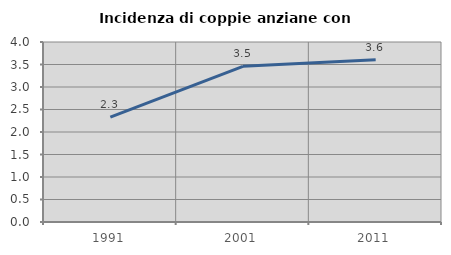
| Category | Incidenza di coppie anziane con figli |
|---|---|
| 1991.0 | 2.329 |
| 2001.0 | 3.46 |
| 2011.0 | 3.608 |